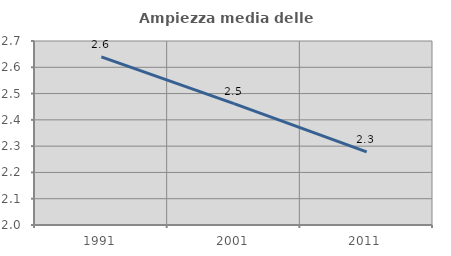
| Category | Ampiezza media delle famiglie |
|---|---|
| 1991.0 | 2.639 |
| 2001.0 | 2.462 |
| 2011.0 | 2.278 |